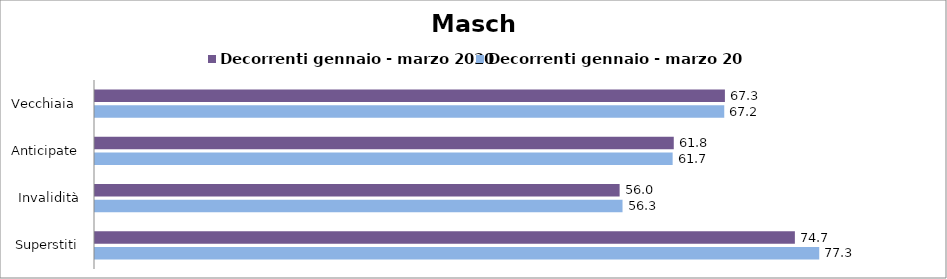
| Category | Decorrenti gennaio - marzo 2020 | Decorrenti gennaio - marzo 2021 |
|---|---|---|
| Vecchiaia  | 67.25 | 67.18 |
| Anticipate | 61.79 | 61.67 |
| Invalidità | 56.01 | 56.32 |
| Superstiti | 74.72 | 77.32 |